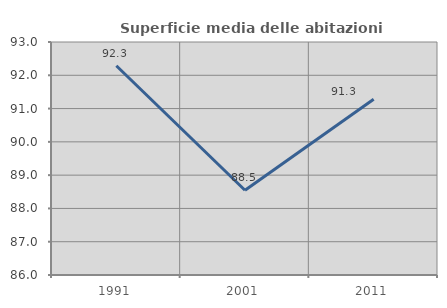
| Category | Superficie media delle abitazioni occupate |
|---|---|
| 1991.0 | 92.287 |
| 2001.0 | 88.547 |
| 2011.0 | 91.282 |